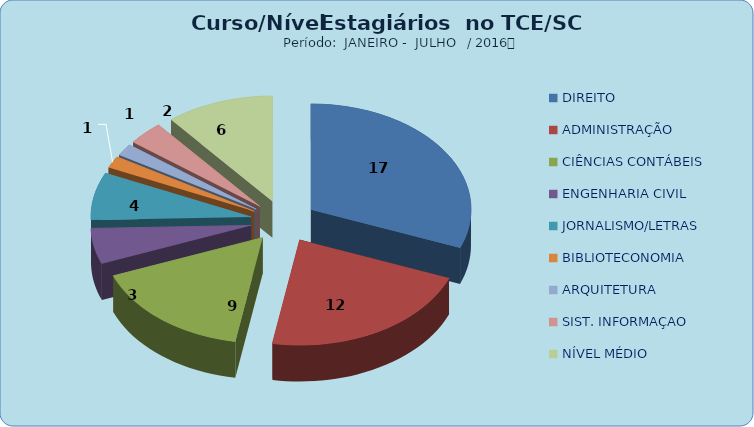
| Category | Series 0 |
|---|---|
| DIREITO | 17 |
| ADMINISTRAÇÃO | 12 |
| CIÊNCIAS CONTÁBEIS | 9 |
| ENGENHARIA CIVIL | 3 |
| JORNALISMO/LETRAS | 4 |
| BIBLIOTECONOMIA | 1 |
| ARQUITETURA | 1 |
| SIST. INFORMAÇAO | 2 |
| NÍVEL MÉDIO | 6 |